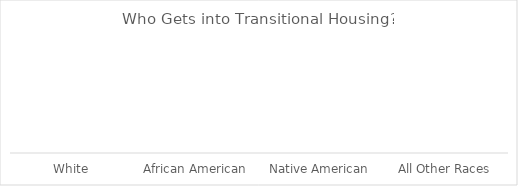
| Category | Series 0 |
|---|---|
| White | 0 |
| African American | 0 |
| Native American | 0 |
| All Other Races | 0 |